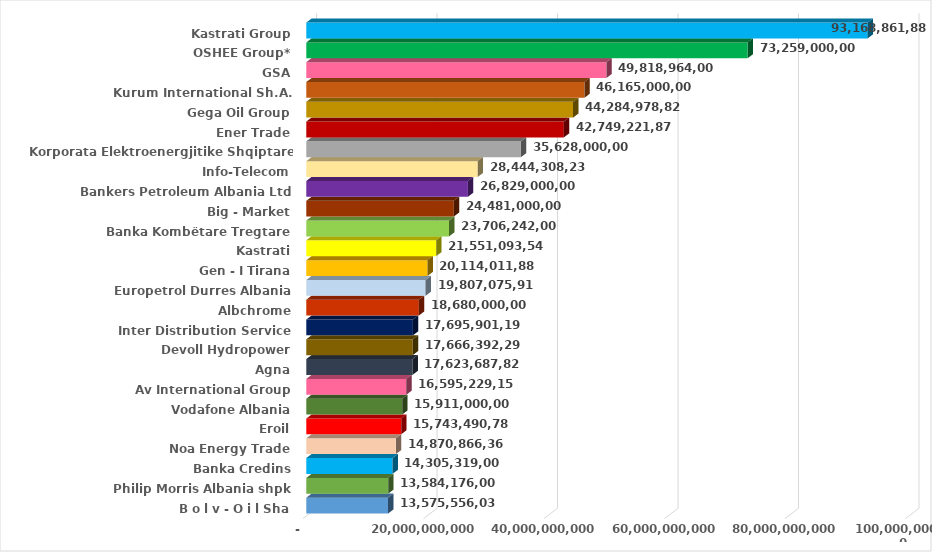
| Category | Të ardhurat Vjetore 2022
(në lekë) |
|---|---|
| B o l v - O i l Sha | 13575556031 |
| Philip Morris Albania shpk | 13584176000 |
| Banka Credins | 14305319000 |
| Noa Energy Trade | 14870866362 |
| Eroil | 15743490788 |
| Vodafone Albania | 15911000000 |
| Av International Group | 16595229151 |
| Agna | 17623687827 |
| Devoll Hydropower | 17666392290 |
| Inter Distribution Service | 17695901198 |
| Albchrome | 18680000000 |
| Europetrol Durres Albania | 19807075910 |
| Gen - I Tirana | 20114011888 |
| Kastrati | 21551093541 |
| Banka Kombëtare Tregtare | 23706242000 |
| Big - Market | 24481000000 |
| Bankers Petroleum Albania Ltd | 26829000000 |
| Info-Telecom | 28444308238 |
| Korporata Elektroenergjitike Shqiptare (KESH) | 35628000000 |
| Ener Trade | 42749221875 |
| Gega Oil Group | 44284978829 |
| Kurum International Sh.A. | 46165000000 |
| GSA | 49818964000 |
| OSHEE Group* | 73259000000 |
| Kastrati Group | 93168861886 |